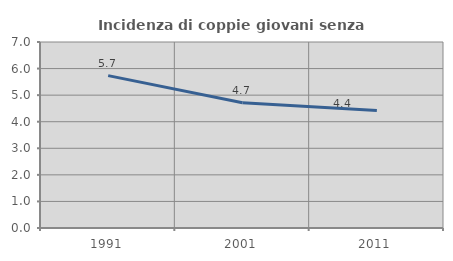
| Category | Incidenza di coppie giovani senza figli |
|---|---|
| 1991.0 | 5.733 |
| 2001.0 | 4.716 |
| 2011.0 | 4.425 |